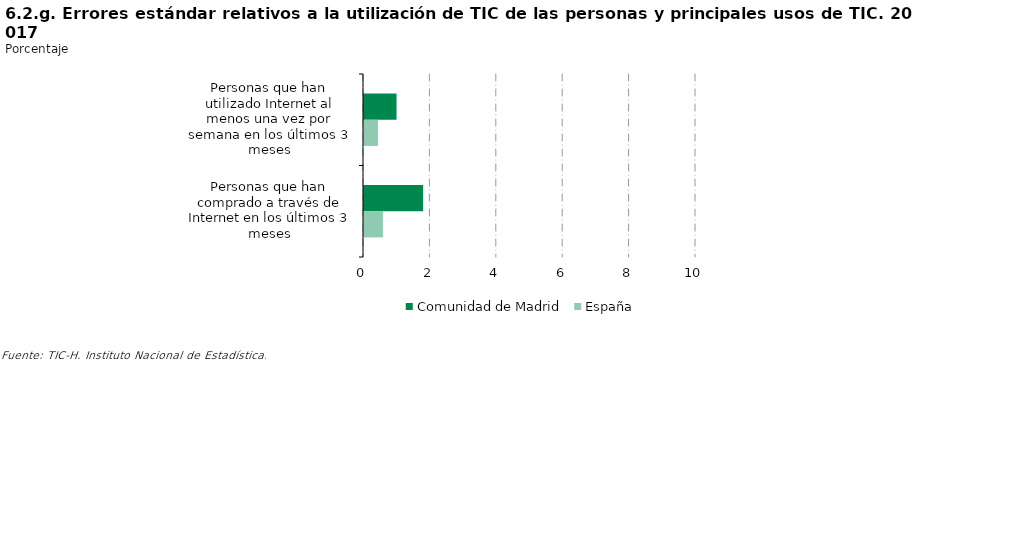
| Category | Comunidad de Madrid | España |
|---|---|---|
| Personas que han utilizado Internet al menos una vez por semana en los últimos 3 meses | 0.98 | 0.42 |
| Personas que han comprado a través de Internet en los últimos 3 meses | 1.78 | 0.57 |